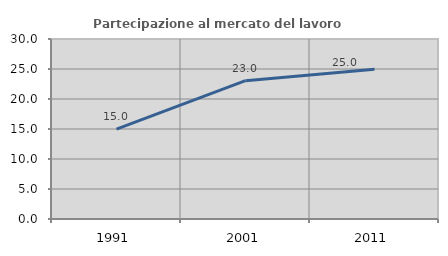
| Category | Partecipazione al mercato del lavoro  femminile |
|---|---|
| 1991.0 | 14.988 |
| 2001.0 | 23.049 |
| 2011.0 | 24.971 |